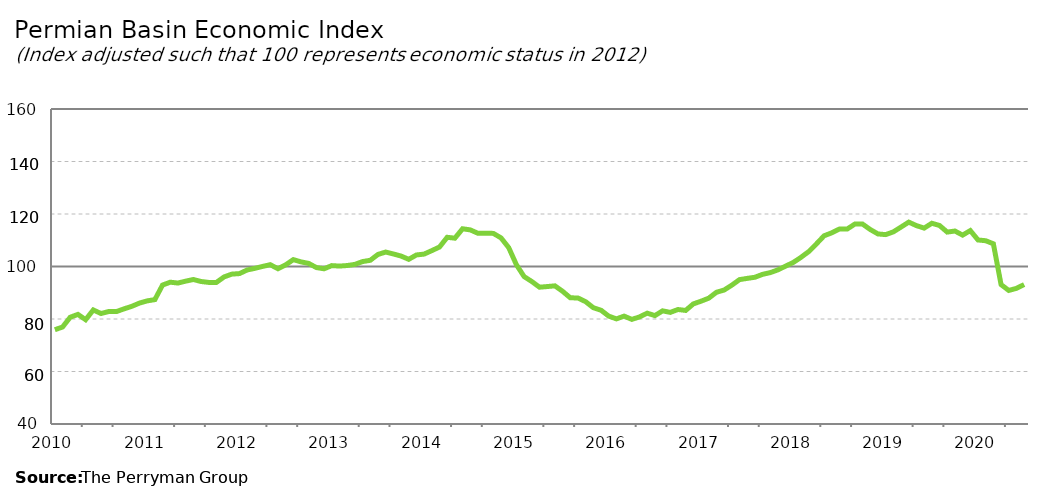
| Category | Permian Basin Composite |
|---|---|
| 2010-01-31 | 75.914 |
| 2010-02-28 | 76.947 |
| 2010-03-31 | 80.672 |
| 2010-04-30 | 81.758 |
| 2010-05-31 | 79.734 |
| 2010-06-30 | 83.443 |
| 2010-07-31 | 82.086 |
| 2010-08-31 | 82.845 |
| 2010-09-30 | 82.819 |
| 2010-10-31 | 83.871 |
| 2010-11-30 | 84.823 |
| 2010-12-31 | 86.062 |
| 2011-01-31 | 86.9 |
| 2011-02-28 | 87.384 |
| 2011-03-31 | 92.929 |
| 2011-04-30 | 94.016 |
| 2011-05-31 | 93.7 |
| 2011-06-30 | 94.41 |
| 2011-07-31 | 95.05 |
| 2011-08-31 | 94.288 |
| 2011-09-30 | 93.94 |
| 2011-10-31 | 93.937 |
| 2011-11-30 | 96.028 |
| 2011-12-31 | 97.096 |
| 2012-01-31 | 97.3 |
| 2012-02-29 | 98.676 |
| 2012-03-31 | 99.294 |
| 2012-04-30 | 100.026 |
| 2012-05-31 | 100.691 |
| 2012-06-30 | 99.153 |
| 2012-07-31 | 100.623 |
| 2012-08-31 | 102.623 |
| 2012-09-30 | 101.757 |
| 2012-10-31 | 101.169 |
| 2012-11-30 | 99.592 |
| 2012-12-31 | 99.128 |
| 2013-01-31 | 100.343 |
| 2013-02-28 | 100.161 |
| 2013-03-31 | 100.372 |
| 2013-04-30 | 100.801 |
| 2013-05-31 | 101.88 |
| 2013-06-30 | 102.356 |
| 2013-07-31 | 104.587 |
| 2013-08-31 | 105.505 |
| 2013-09-30 | 104.783 |
| 2013-10-31 | 103.98 |
| 2013-11-30 | 102.733 |
| 2013-12-31 | 104.398 |
| 2014-01-31 | 104.723 |
| 2014-02-28 | 106.049 |
| 2014-03-31 | 107.415 |
| 2014-04-30 | 111.128 |
| 2014-05-31 | 110.789 |
| 2014-06-30 | 114.368 |
| 2014-07-31 | 113.949 |
| 2014-08-31 | 112.65 |
| 2014-09-30 | 112.652 |
| 2014-10-31 | 112.614 |
| 2014-11-30 | 110.9 |
| 2014-12-31 | 107.181 |
| 2015-01-31 | 100.67 |
| 2015-02-28 | 96.16 |
| 2015-03-31 | 94.279 |
| 2015-04-30 | 92.114 |
| 2015-05-31 | 92.36 |
| 2015-06-30 | 92.628 |
| 2015-07-31 | 90.563 |
| 2015-08-31 | 88.084 |
| 2015-09-30 | 88.004 |
| 2015-10-31 | 86.595 |
| 2015-11-30 | 84.294 |
| 2015-12-31 | 83.34 |
| 2016-01-31 | 81.096 |
| 2016-02-29 | 80.045 |
| 2016-03-31 | 81.092 |
| 2016-04-30 | 79.859 |
| 2016-05-31 | 80.779 |
| 2016-06-30 | 82.228 |
| 2016-07-31 | 81.287 |
| 2016-08-31 | 83.109 |
| 2016-09-30 | 82.518 |
| 2016-10-31 | 83.614 |
| 2016-11-30 | 83.266 |
| 2016-12-31 | 85.756 |
| 2017-01-31 | 86.782 |
| 2017-02-28 | 87.932 |
| 2017-03-31 | 90.182 |
| 2017-04-30 | 91.035 |
| 2017-05-31 | 92.891 |
| 2017-06-30 | 95.001 |
| 2017-07-31 | 95.473 |
| 2017-08-31 | 95.898 |
| 2017-09-30 | 97.013 |
| 2017-10-31 | 97.675 |
| 2017-11-30 | 98.726 |
| 2017-12-31 | 100.156 |
| 2018-01-31 | 101.568 |
| 2018-02-28 | 103.513 |
| 2018-03-31 | 105.695 |
| 2018-04-30 | 108.624 |
| 2018-05-31 | 111.713 |
| 2018-06-30 | 112.839 |
| 2018-07-31 | 114.294 |
| 2018-08-31 | 114.279 |
| 2018-09-30 | 116.175 |
| 2018-10-31 | 116.148 |
| 2018-11-30 | 114.076 |
| 2018-12-31 | 112.408 |
| 2019-01-31 | 112.146 |
| 2019-02-28 | 113.199 |
| 2019-03-31 | 115.033 |
| 2019-04-30 | 116.901 |
| 2019-05-31 | 115.572 |
| 2019-06-30 | 114.623 |
| 2019-07-31 | 116.473 |
| 2019-08-31 | 115.622 |
| 2019-09-30 | 113.109 |
| 2019-10-31 | 113.515 |
| 2019-11-30 | 111.956 |
| 2019-12-31 | 113.681 |
| 2020-01-31 | 110.112 |
| 2020-02-29 | 109.817 |
| 2020-03-31 | 108.648 |
| 2020-04-30 | 93.107 |
| 2020-05-31 | 90.879 |
| 2020-06-30 | 91.674 |
| 2020-07-31 | 93.126 |